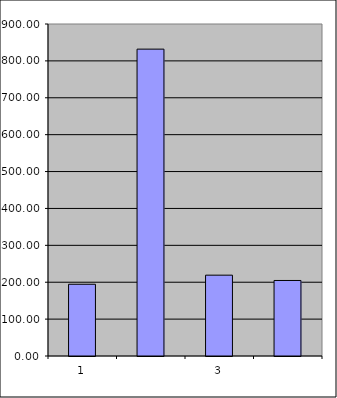
| Category | Series 0 |
|---|---|
| 0 | 194.5 |
| 1 | 831.867 |
| 2 | 219.136 |
| 3 | 204.729 |